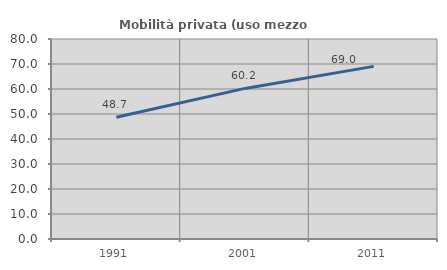
| Category | Mobilità privata (uso mezzo privato) |
|---|---|
| 1991.0 | 48.689 |
| 2001.0 | 60.238 |
| 2011.0 | 69.048 |